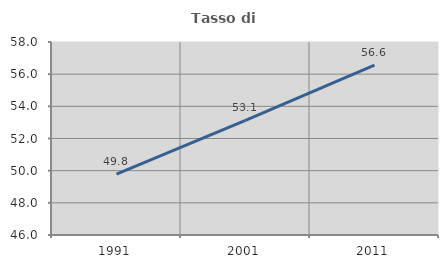
| Category | Tasso di occupazione   |
|---|---|
| 1991.0 | 49.781 |
| 2001.0 | 53.124 |
| 2011.0 | 56.556 |